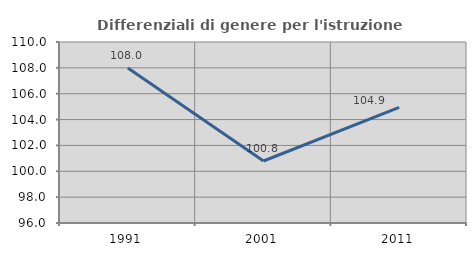
| Category | Differenziali di genere per l'istruzione superiore |
|---|---|
| 1991.0 | 107.985 |
| 2001.0 | 100.796 |
| 2011.0 | 104.947 |